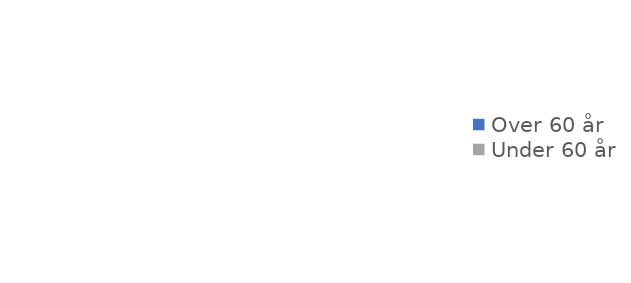
| Category | Over 60 år |
|---|---|
| Over 60 år | 0 |
| Under 60 år | 0 |